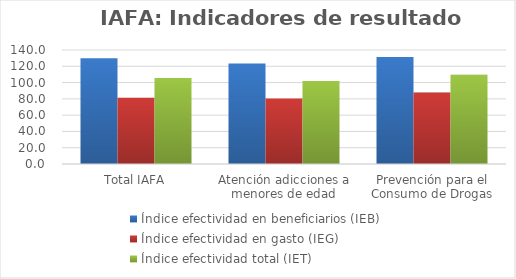
| Category | Índice efectividad en beneficiarios (IEB) | Índice efectividad en gasto (IEG)  | Índice efectividad total (IET) |
|---|---|---|---|
| Total IAFA | 129.915 | 81.493 | 105.704 |
| Atención adicciones a menores de edad | 123.513 | 80.527 | 102.02 |
| Prevención para el Consumo de Drogas | 131.393 | 87.747 | 109.57 |